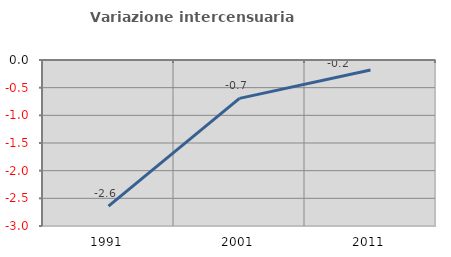
| Category | Variazione intercensuaria annua |
|---|---|
| 1991.0 | -2.64 |
| 2001.0 | -0.694 |
| 2011.0 | -0.182 |